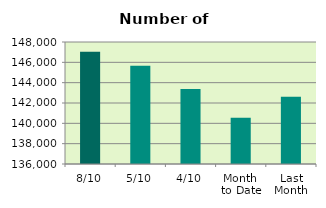
| Category | Series 0 |
|---|---|
| 8/10 | 147050 |
| 5/10 | 145670 |
| 4/10 | 143372 |
| Month 
to Date | 140544 |
| Last
Month | 142606.2 |